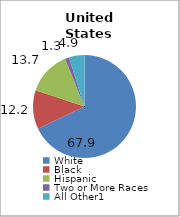
| Category | 50 states and D.C.2 |
|---|---|
| White | 67.919 |
| Black | 12.198 |
| Hispanic | 13.706 |
| Two or More Races | 1.307 |
| All Other1 | 4.87 |